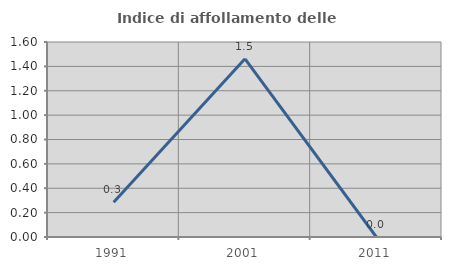
| Category | Indice di affollamento delle abitazioni  |
|---|---|
| 1991.0 | 0.285 |
| 2001.0 | 1.462 |
| 2011.0 | 0 |